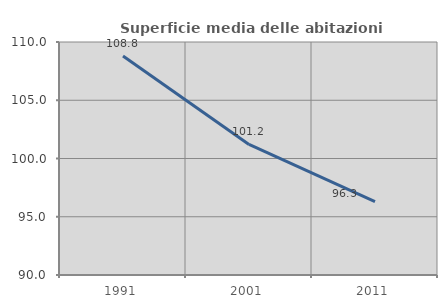
| Category | Superficie media delle abitazioni occupate |
|---|---|
| 1991.0 | 108.803 |
| 2001.0 | 101.204 |
| 2011.0 | 96.307 |